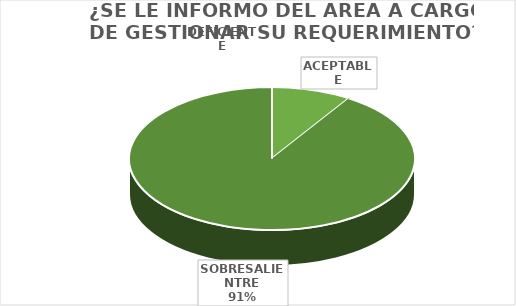
| Category | Series 0 |
|---|---|
| DEFICIENTE | 0 |
| ACEPTABLE | 15 |
| SOBRESALIENTRE | 151 |